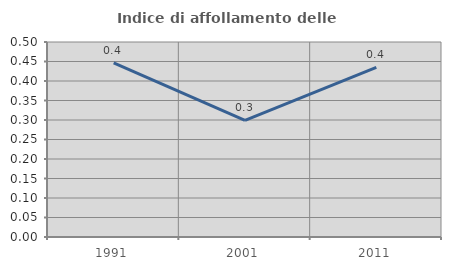
| Category | Indice di affollamento delle abitazioni  |
|---|---|
| 1991.0 | 0.447 |
| 2001.0 | 0.299 |
| 2011.0 | 0.435 |